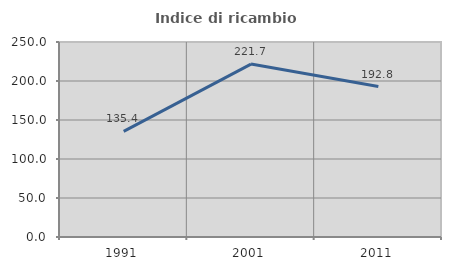
| Category | Indice di ricambio occupazionale  |
|---|---|
| 1991.0 | 135.437 |
| 2001.0 | 221.675 |
| 2011.0 | 192.832 |